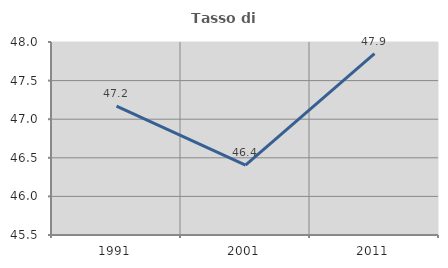
| Category | Tasso di occupazione   |
|---|---|
| 1991.0 | 47.168 |
| 2001.0 | 46.407 |
| 2011.0 | 47.85 |